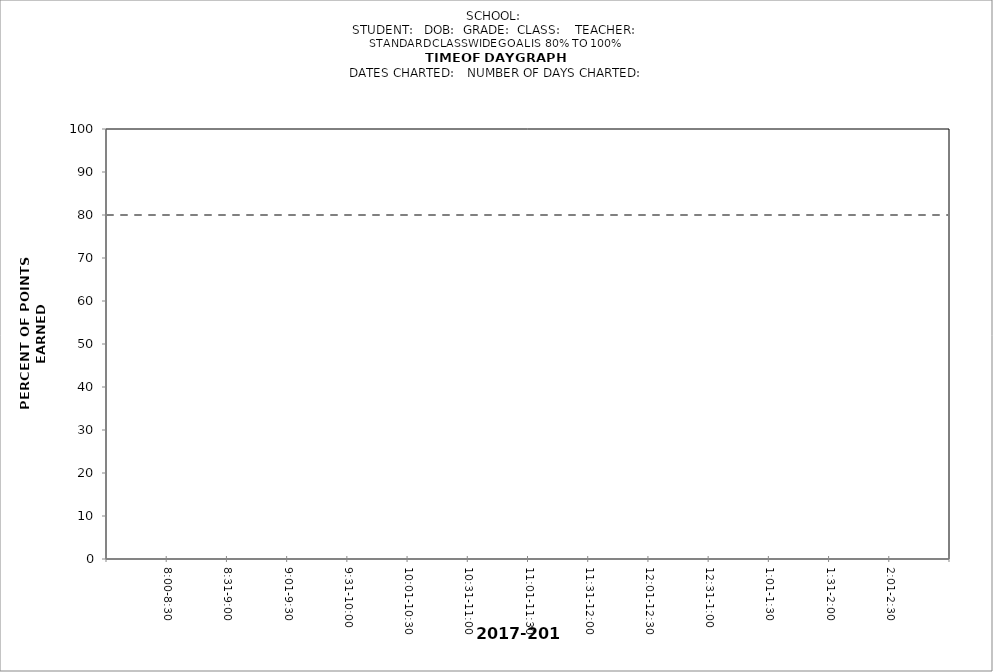
| Category | PERCENTAGE | target |
|---|---|---|
|  |  | 80 |
| 8:00-8:30 |  | 80 |
| 8:31-9:00 |  | 80 |
| 9:01-9:30 |  | 80 |
| 9:31-10:00 |  | 80 |
| 10:01-10:30 |  | 80 |
| 10:31-11:00 |  | 80 |
| 11:01-11:30 |  | 80 |
| 11:31-12:00 |  | 80 |
| 12:01-12:30 |  | 80 |
| 12:31-1:00 |  | 80 |
| 1:01-1:30 |  | 80 |
| 1:31-2:00 |  | 80 |
| 2:01-2:30 |  | 80 |